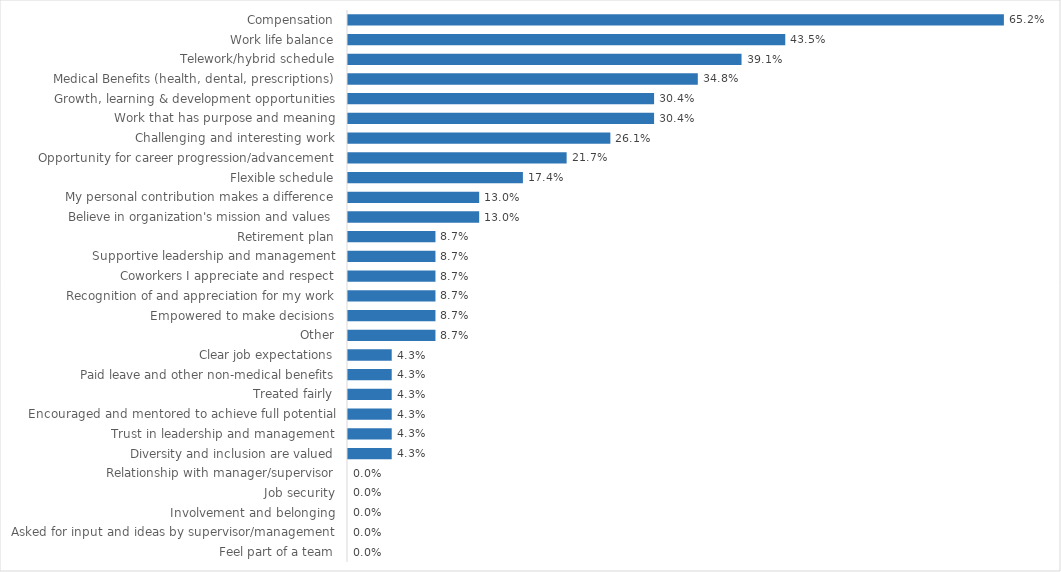
| Category | Agency of Natural Resources - CO |
|---|---|
| Compensation | 0.652 |
| Work life balance | 0.435 |
| Telework/hybrid schedule | 0.391 |
| Medical Benefits (health, dental, prescriptions) | 0.348 |
| Growth, learning & development opportunities | 0.304 |
| Work that has purpose and meaning | 0.304 |
| Challenging and interesting work | 0.261 |
| Opportunity for career progression/advancement | 0.217 |
| Flexible schedule | 0.174 |
| My personal contribution makes a difference | 0.13 |
| Believe in organization's mission and values | 0.13 |
| Retirement plan | 0.087 |
| Supportive leadership and management | 0.087 |
| Coworkers I appreciate and respect | 0.087 |
| Recognition of and appreciation for my work | 0.087 |
| Empowered to make decisions | 0.087 |
| Other | 0.087 |
| Clear job expectations | 0.043 |
| Paid leave and other non-medical benefits | 0.043 |
| Treated fairly | 0.043 |
| Encouraged and mentored to achieve full potential | 0.043 |
| Trust in leadership and management | 0.043 |
| Diversity and inclusion are valued | 0.043 |
| Relationship with manager/supervisor | 0 |
| Job security | 0 |
| Involvement and belonging | 0 |
| Asked for input and ideas by supervisor/management | 0 |
| Feel part of a team | 0 |